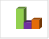
| Category | област Сливен |
|---|---|
| летен сезон 2019  | 36621 |
| летен сезон 2021  | 33556 |
| летен сезон 2022 г.  | 34143 |